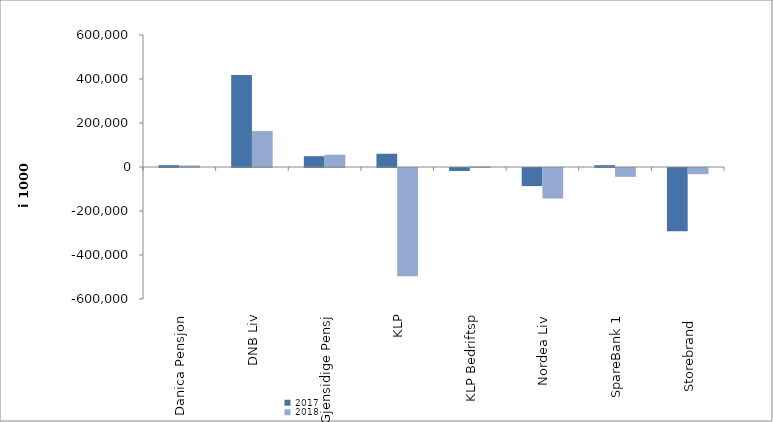
| Category | 2017 | 2018 |
|---|---|---|
| Danica Pensjon | 8391.221 | 7172.333 |
| DNB Liv | 418326 | 163223 |
| Gjensidige Pensj | 49196 | 55886 |
| KLP | 60236.105 | -492216.585 |
| KLP Bedriftsp | -13513 | 3095 |
| Nordea Liv | -82238.519 | -138834.616 |
| SpareBank 1 | 8306.156 | -40094.756 |
| Storebrand  | -286957.934 | -27854.513 |